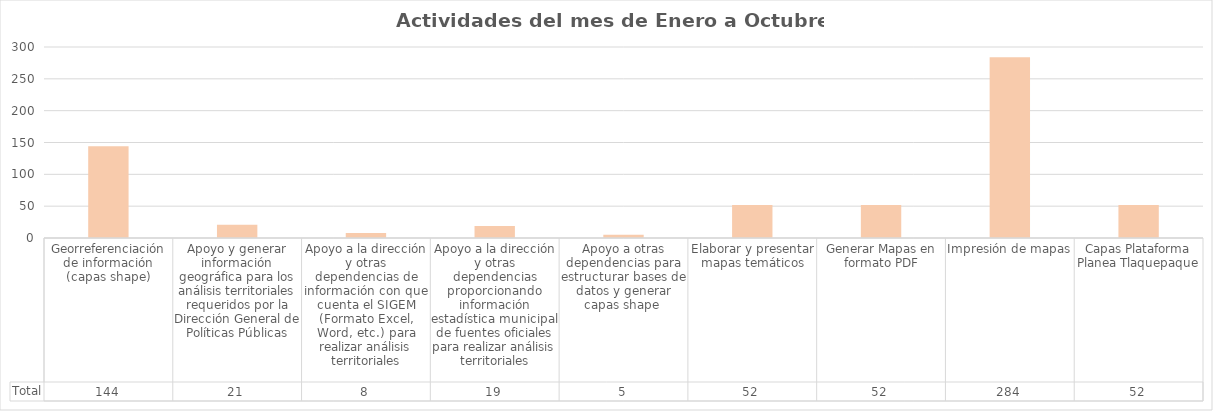
| Category | Total |
|---|---|
| Georreferenciación de información (capas shape) | 144 |
| Apoyo y generar información geográfica para los análisis territoriales requeridos por la Dirección General de Políticas Públicas | 21 |
| Apoyo a la dirección y otras dependencias de información con que cuenta el SIGEM (Formato Excel, Word, etc.) para realizar análisis territoriales | 8 |
| Apoyo a la dirección y otras dependencias proporcionando información estadística municipal de fuentes oficiales para realizar análisis territoriales | 19 |
| Apoyo a otras dependencias para estructurar bases de datos y generar capas shape  | 5 |
| Elaborar y presentar mapas temáticos | 52 |
| Generar Mapas en formato PDF | 52 |
| Impresión de mapas | 284 |
| Capas Plataforma Planea Tlaquepaque | 52 |